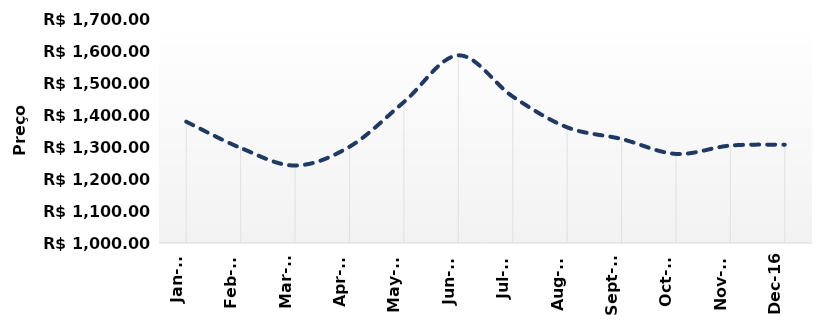
| Category | preço |
|---|---|
| 2016-01-01 | 1379.1 |
| 2016-02-01 | 1297.158 |
| 2016-03-01 | 1242.129 |
| 2016-04-01 | 1300.708 |
| 2016-05-01 | 1440.421 |
| 2016-06-01 | 1586.47 |
| 2016-07-01 | 1457.738 |
| 2016-08-01 | 1361.536 |
| 2016-09-01 | 1325 |
| 2016-10-01 | 1278.392 |
| 2016-11-01 | 1304.542 |
| 2016-12-01 | 1307.151 |